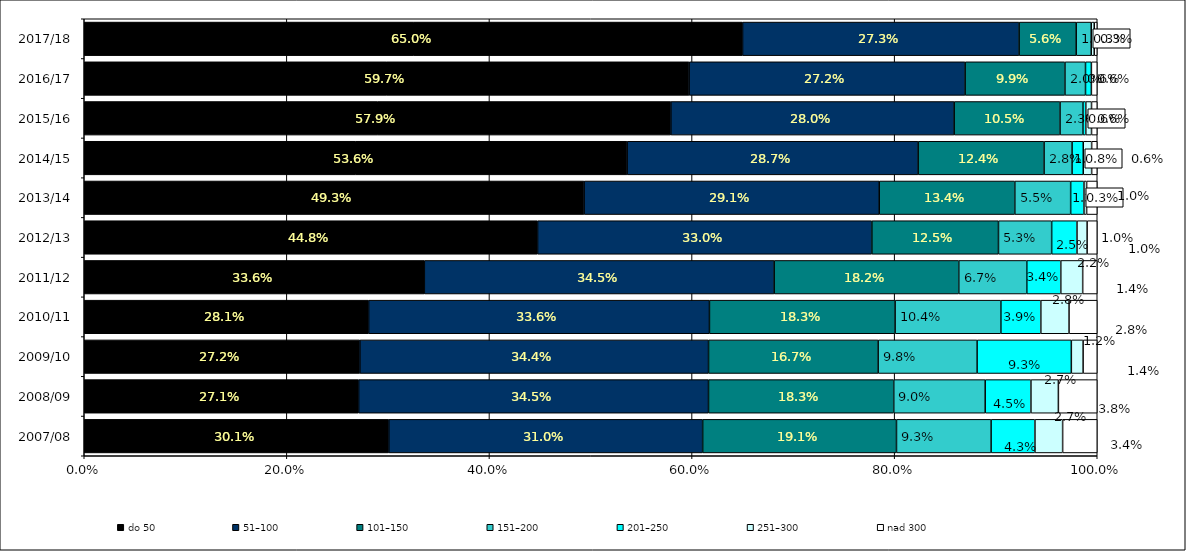
| Category | do 50 | 51–100 | 101–150 | 151–200 | 201–250 | 251–300 | nad 300 |
|---|---|---|---|---|---|---|---|
| 2007/08 | 0.301 | 0.31 | 0.191 | 0.093 | 0.043 | 0.027 | 0.034 |
| 2008/09 | 0.271 | 0.345 | 0.183 | 0.09 | 0.045 | 0.027 | 0.038 |
| 2009/10 | 0.272 | 0.344 | 0.167 | 0.098 | 0.093 | 0.012 | 0.014 |
| 2010/11 | 0.281 | 0.336 | 0.183 | 0.104 | 0.039 | 0.028 | 0.028 |
| 2011/12 | 0.336 | 0.345 | 0.182 | 0.067 | 0.034 | 0.022 | 0.014 |
| 2012/13 | 0.448 | 0.33 | 0.125 | 0.052 | 0.025 | 0.01 | 0.01 |
| 2013/14 | 0.493 | 0.291 | 0.134 | 0.055 | 0.013 | 0.003 | 0.01 |
| 2014/15 | 0.536 | 0.287 | 0.124 | 0.028 | 0.011 | 0.008 | 0.006 |
| 2015/16 | 0.579 | 0.28 | 0.105 | 0.023 | 0.003 | 0.006 | 0.006 |
| 2016/17 | 0.597 | 0.272 | 0.099 | 0.02 | 0.006 | 0 | 0.006 |
| 2017/18 | 0.65 | 0.273 | 0.056 | 0.015 | 0 | 0.003 | 0.003 |